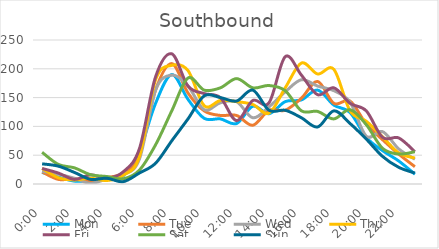
| Category | Mon | Tue | Wed | Thu | Fri | Sat | Sun |
|---|---|---|---|---|---|---|---|
| 0.0 | 20 | 21 | 22 | 27 | 27 | 55 | 35 |
| 0.041667 | 12 | 8 | 17 | 11 | 19 | 34 | 31 |
| 0.083333 | 5 | 9 | 10 | 7 | 8 | 28 | 20 |
| 0.125 | 6 | 6 | 1 | 10 | 16 | 16 | 8 |
| 0.166667 | 8 | 11 | 9 | 6 | 10 | 13 | 10 |
| 0.208333 | 14 | 19 | 16 | 15 | 21 | 9 | 4 |
| 0.25 | 57 | 49 | 43 | 47 | 61 | 24 | 19 |
| 0.291667 | 140 | 163 | 163 | 181 | 186 | 68 | 36 |
| 0.333333 | 190 | 209 | 189 | 206 | 226 | 127 | 75 |
| 0.375 | 147 | 158 | 170 | 197 | 170 | 184 | 113 |
| 0.416667 | 114 | 127 | 129 | 136 | 157 | 163 | 153 |
| 0.458333 | 113 | 119 | 141 | 145 | 150 | 167 | 150 |
| 0.5 | 105 | 119 | 143 | 143 | 110 | 183 | 144 |
| 0.541667 | 135 | 102 | 115 | 138 | 145 | 167 | 163 |
| 0.5833333333333334 | 122 | 128 | 134 | 123 | 141 | 171 | 128 |
| 0.625 | 143 | 128 | 160 | 167 | 221 | 162 | 128 |
| 0.666667 | 146 | 149 | 181 | 210 | 189 | 127 | 115 |
| 0.708333 | 163 | 178 | 170 | 191 | 155 | 126 | 99 |
| 0.75 | 137 | 140 | 162 | 199 | 167 | 113 | 127 |
| 0.791667 | 124 | 144 | 142 | 127 | 140 | 129 | 105 |
| 0.833333 | 81 | 104 | 83 | 109 | 127 | 103 | 78 |
| 0.875 | 58 | 77 | 91 | 82 | 81 | 62 | 48 |
| 0.916667 | 40 | 52 | 61 | 54 | 80 | 52 | 29 |
| 0.958333 | 17 | 30 | 43 | 45 | 56 | 56 | 19 |